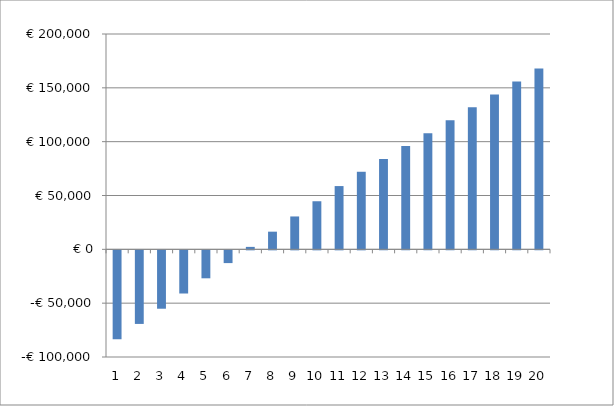
| Category | Series 0 |
|---|---|
| 0 | -82491.521 |
| 1 | -68355.198 |
| 2 | -54225.242 |
| 3 | -40099.538 |
| 4 | -25975.946 |
| 5 | -11852.307 |
| 6 | 2273.567 |
| 7 | 16403.883 |
| 8 | 30540.875 |
| 9 | 44662.55 |
| 10 | 58754.935 |
| 11 | 72044.369 |
| 12 | 83964.863 |
| 13 | 95903.595 |
| 14 | 107862.962 |
| 15 | 119845.389 |
| 16 | 131853.334 |
| 17 | 143889.282 |
| 18 | 155955.755 |
| 19 | 168055.303 |